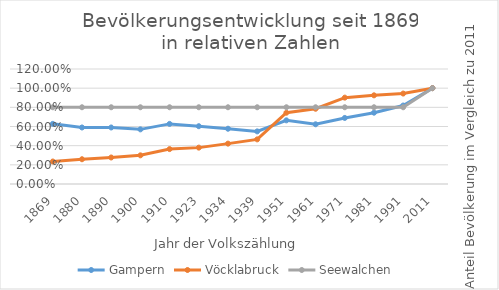
| Category | Gampern | Vöcklabruck | Seewalchen |
|---|---|---|---|
| 2011 | 1 | 1 | 1 |
| 1991 | 0.819 | 0.944 | 0.801 |
| 1981 | 0.744 | 0.925 | 0.801 |
| 1971 | 0.689 | 0.901 | 0.801 |
| 1961 | 0.623 | 0.785 | 0.801 |
| 1951 | 0.664 | 0.744 | 0.801 |
| 1939 | 0.549 | 0.466 | 0.801 |
| 1934 | 0.577 | 0.421 | 0.801 |
| 1923 | 0.603 | 0.38 | 0.801 |
| 1910 | 0.627 | 0.364 | 0.801 |
| 1900 | 0.57 | 0.299 | 0.801 |
| 1890 | 0.59 | 0.277 | 0.801 |
| 1880 | 0.59 | 0.258 | 0.801 |
| 1869 | 0.628 | 0.235 | 0.801 |